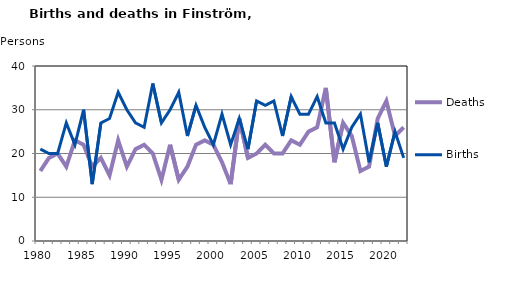
| Category | Deaths | Births |
|---|---|---|
| 1980.0 | 16 | 21 |
| 1981.0 | 19 | 20 |
| 1982.0 | 20 | 20 |
| 1983.0 | 17 | 27 |
| 1984.0 | 23 | 22 |
| 1985.0 | 22 | 30 |
| 1986.0 | 17 | 13 |
| 1987.0 | 19 | 27 |
| 1988.0 | 15 | 28 |
| 1989.0 | 23 | 34 |
| 1990.0 | 17 | 30 |
| 1991.0 | 21 | 27 |
| 1992.0 | 22 | 26 |
| 1993.0 | 20 | 36 |
| 1994.0 | 14 | 27 |
| 1995.0 | 22 | 30 |
| 1996.0 | 14 | 34 |
| 1997.0 | 17 | 24 |
| 1998.0 | 22 | 31 |
| 1999.0 | 23 | 26 |
| 2000.0 | 22 | 22 |
| 2001.0 | 18 | 29 |
| 2002.0 | 13 | 22 |
| 2003.0 | 28 | 28 |
| 2004.0 | 19 | 21 |
| 2005.0 | 20 | 32 |
| 2006.0 | 22 | 31 |
| 2007.0 | 20 | 32 |
| 2008.0 | 20 | 24 |
| 2009.0 | 23 | 33 |
| 2010.0 | 22 | 29 |
| 2011.0 | 25 | 29 |
| 2012.0 | 26 | 33 |
| 2013.0 | 35 | 27 |
| 2014.0 | 18 | 27 |
| 2015.0 | 27 | 21 |
| 2016.0 | 24 | 26 |
| 2017.0 | 16 | 29 |
| 2018.0 | 17 | 18 |
| 2019.0 | 28 | 27 |
| 2020.0 | 32 | 17 |
| 2021.0 | 24 | 25 |
| 2022.0 | 26 | 19 |